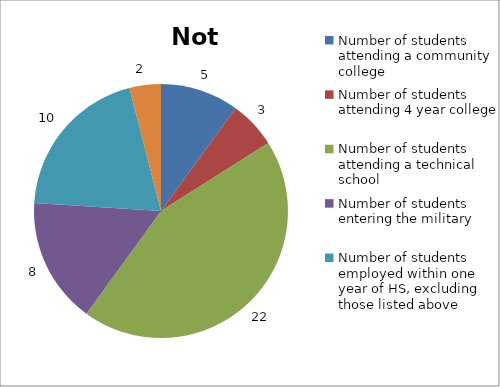
| Category | Not Reported |
|---|---|
| Number of students attending a community college | 5 |
| Number of students attending 4 year college | 3 |
| Number of students attending a technical school | 22 |
| Number of students entering the military | 8 |
| Number of students employed within one year of HS, excluding those listed above | 10 |
| Not employed, attending college, or joining the military | 2 |